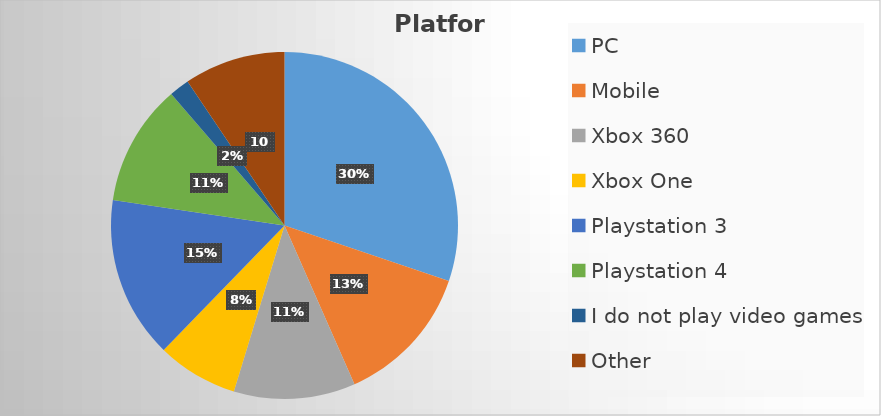
| Category | Series 0 |
|---|---|
| PC | 16 |
| Mobile | 7 |
| Xbox 360 | 6 |
| Xbox One | 4 |
| Playstation 3 | 8 |
| Playstation 4 | 6 |
| I do not play video games | 1 |
| Other | 5 |